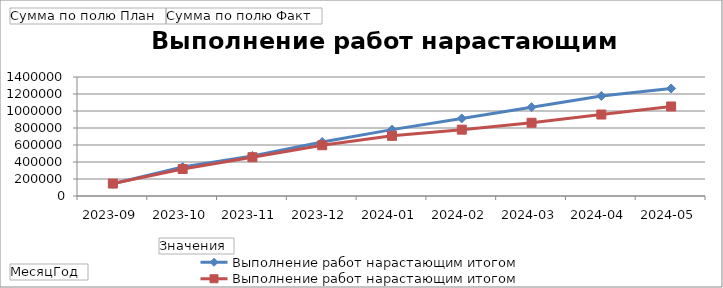
| Category | Сумма по полю План | Сумма по полю Факт |
|---|---|---|
| 2023-09 | 144000 | 146400 |
| 2023-10 | 340800 | 317760 |
| 2023-11 | 472022 | 456071 |
| 2023-12 | 635222 | 597191 |
| 2024-01 | 780822 | 707751 |
| 2024-02 | 912822 | 780351 |
| 2024-03 | 1044822 | 861751 |
| 2024-04 | 1176822 | 958551 |
| 2024-05 | 1264822 | 1053151 |